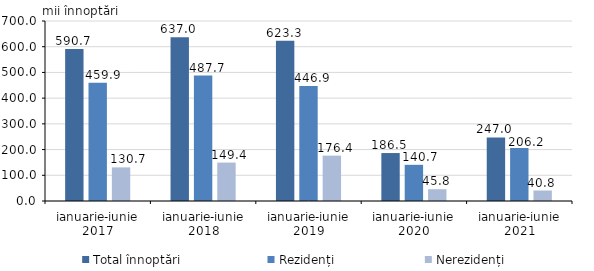
| Category | Total înnoptări | Rezidenți  | Nerezidenți |
|---|---|---|---|
| ianuarie-iunie 2017 | 590.7 | 459.9 | 130.7 |
| ianuarie-iunie 2018 | 637 | 487.7 | 149.4 |
| ianuarie-iunie 2019 | 623.3 | 446.9 | 176.4 |
| ianuarie-iunie 2020 | 186.5 | 140.7 | 45.8 |
| ianuarie-iunie 2021 | 247 | 206.2 | 40.8 |